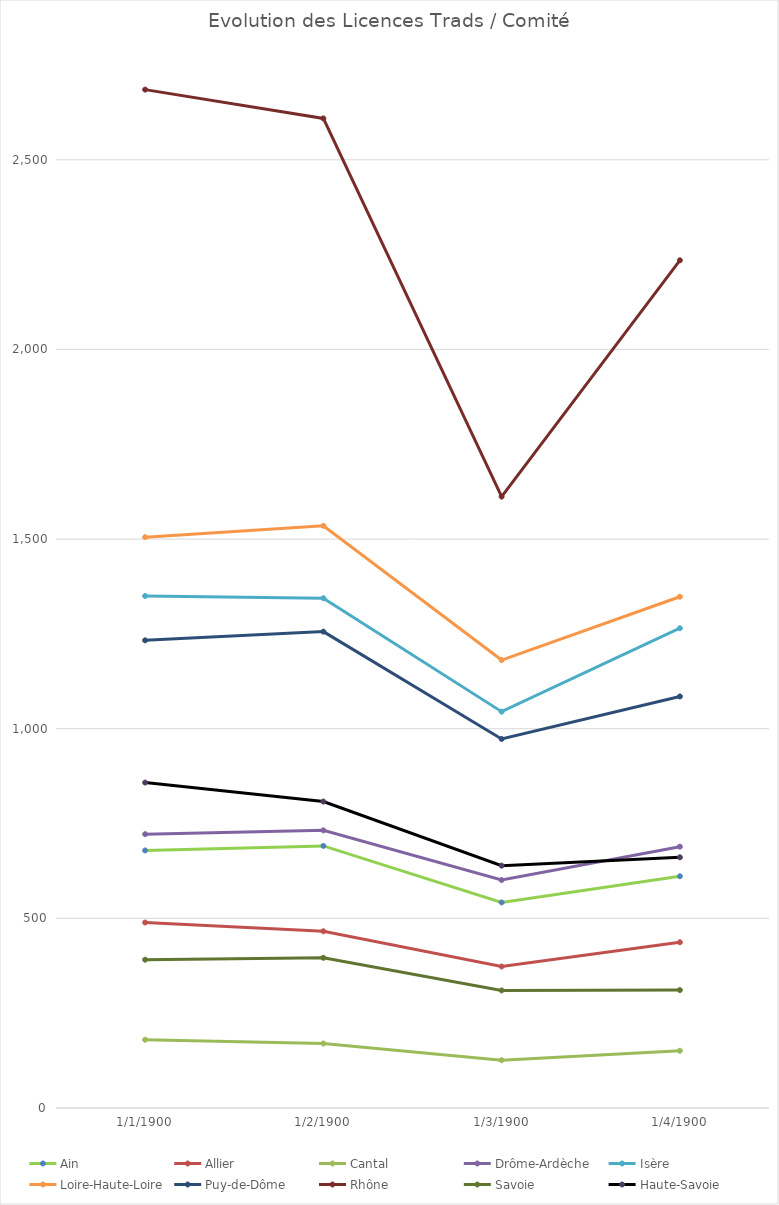
| Category | Ain | Allier | Cantal | Drôme-Ardèche | Isère | Loire-Haute-Loire | Puy-de-Dôme | Rhône | Savoie | Haute-Savoie |
|---|---|---|---|---|---|---|---|---|---|---|
| 0 | 679 | 489 | 180 | 722 | 1350 | 1505 | 1233 | 2685 | 391 | 858 |
| 1 | 691 | 466 | 170 | 732 | 1344 | 1535 | 1256 | 2609 | 396 | 808 |
| 2 | 542 | 373 | 126 | 601 | 1045 | 1181 | 973 | 1612 | 310 | 639 |
| 3 | 611 | 437 | 151 | 689 | 1265 | 1348 | 1085 | 2235 | 311 | 661 |